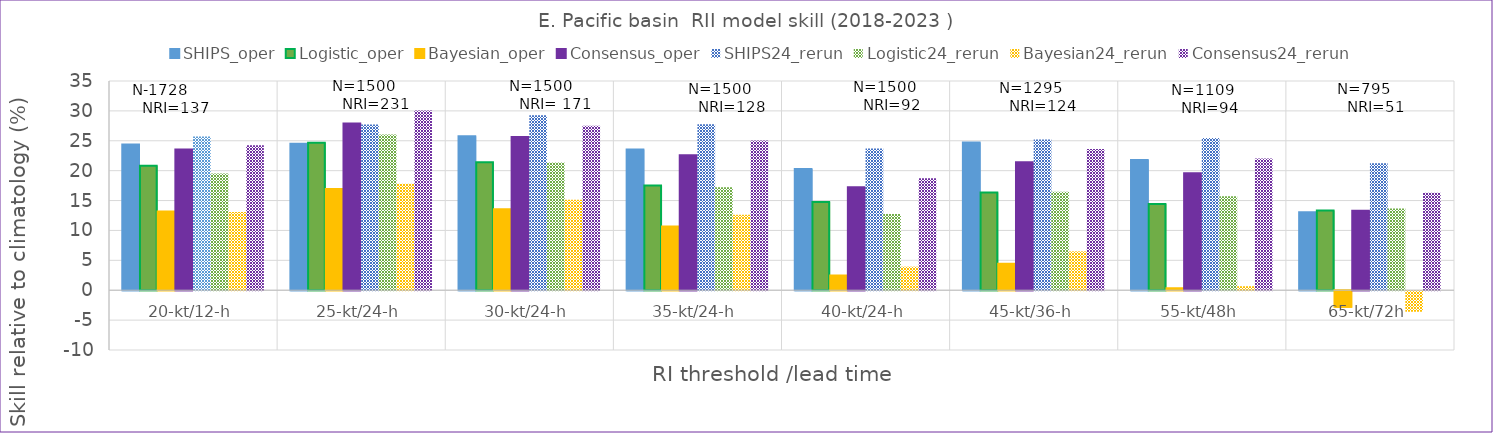
| Category | SHIPS_oper | Logistic_oper | Bayesian_oper | Consensus_oper | SHIPS24_rerun | Logistic24_rerun | Bayesian24_rerun | Consensus24_rerun |
|---|---|---|---|---|---|---|---|---|
| 20-kt/12-h | 24.36 | 20.84 | 13.15 | 23.56 | 25.71 | 19.54 | 13.09 | 24.27 |
| 25-kt/24-h | 24.51 | 24.69 | 16.93 | 27.89 | 27.72 | 26.04 | 17.82 | 30.07 |
| 30-kt/24-h | 25.75 | 21.42 | 13.56 | 25.63 | 29.26 | 21.36 | 15.13 | 27.52 |
| 35-kt/24-h | 23.56 | 17.51 | 10.64 | 22.58 | 27.75 | 17.24 | 12.61 | 25.06 |
| 40-kt/24-h | 20.26 | 14.77 | 2.45 | 17.21 | 23.72 | 12.77 | 3.94 | 18.72 |
| 45-kt/36-h | 24.71 | 16.33 | 4.41 | 21.39 | 25.21 | 16.46 | 6.5 | 23.61 |
| 55-kt/48h | 21.8 | 14.44 | 0.35 | 19.58 | 25.47 | 15.73 | 0.67 | 22.02 |
| 65-kt/72h | 13.03 | 13.35 | -2.77 | 13.31 | 21.23 | 13.69 | -3.43 | 16.3 |